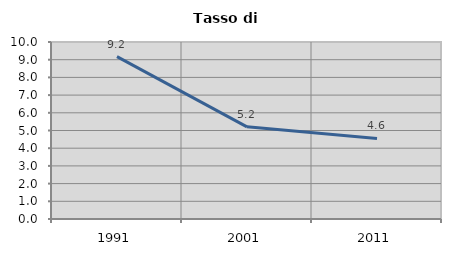
| Category | Tasso di disoccupazione   |
|---|---|
| 1991.0 | 9.176 |
| 2001.0 | 5.208 |
| 2011.0 | 4.554 |